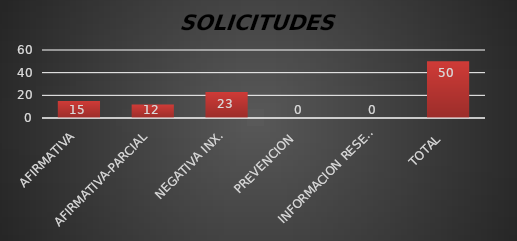
| Category | Series 1 |
|---|---|
| AFIRMATIVA | 15 |
| AFIRMATIVA-PARCIAL | 12 |
| NEGATIVA INX. | 23 |
| PREVENCION  | 0 |
| INFORMACION RESERVADA | 0 |
| TOTAL  | 50 |